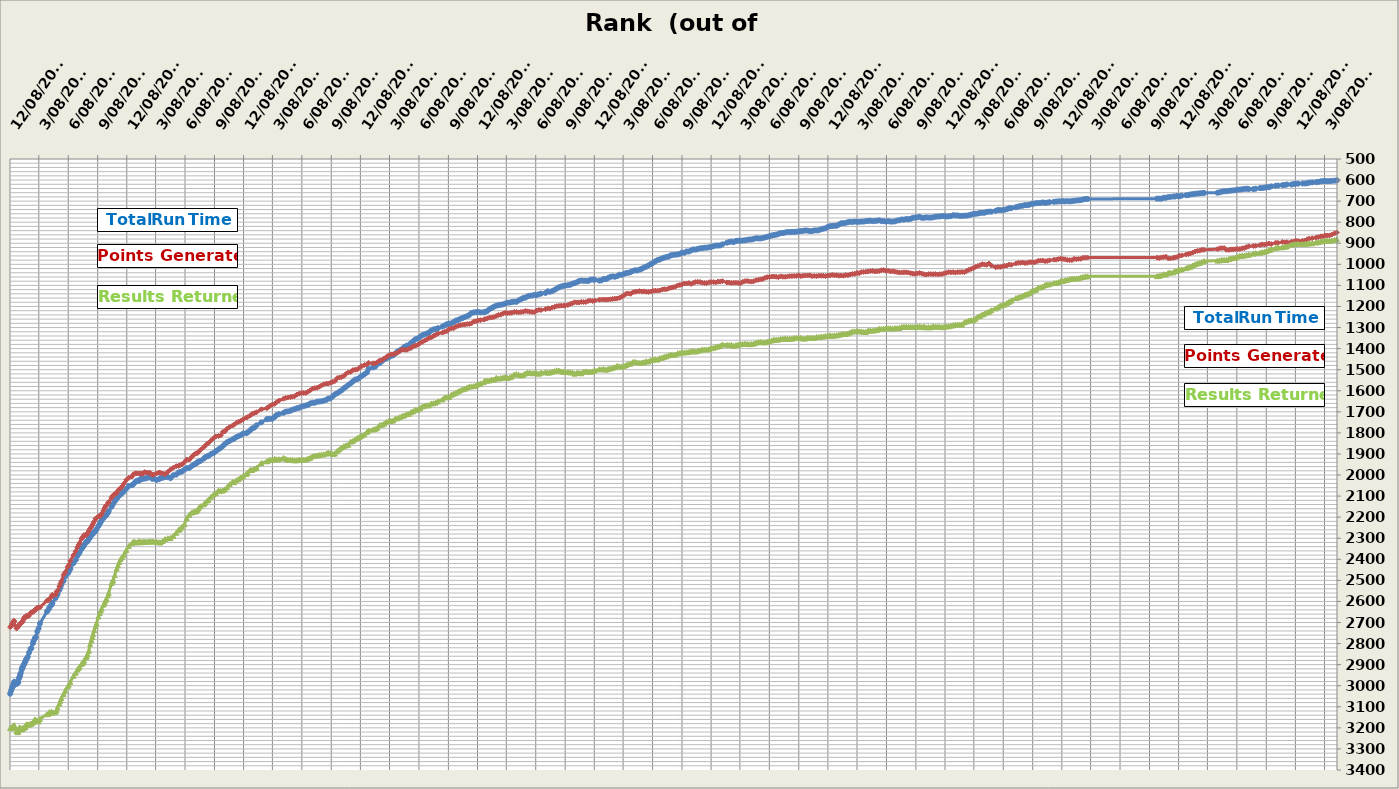
| Category | Series 0 | Series 1 | Series 2 |
|---|---|---|---|
| 2012-12-08 | 3038 | 2722 | 3201 |
| 2012-12-11 | 3024 | 2717 | 3199 |
| 2012-12-13 | 3014 | 2713 | 3202 |
| 2012-12-15 | 3005 | 2705 | 3197 |
| 2012-12-16 | 3003 | 2704 | 3196 |
| 2012-12-17 | 3002 | 2701 | 3196 |
| 2012-12-18 | 2995 | 2697 | 3193 |
| 2012-12-19 | 2992 | 2693 | 3191 |
| 2012-12-20 | 2991 | 2697 | 3190 |
| 2012-12-21 | 2981 | 2693 | 3187 |
| 2012-12-28 | 2992 | 2728 | 3215 |
| 2012-12-31 | 2988 | 2721 | 3220 |
| 2013-01-01 | 2984 | 2722 | 3220 |
| 2013-01-02 | 2983 | 2716 | 3215 |
| 2013-01-04 | 2967 | 2714 | 3202 |
| 2013-01-06 | 2959 | 2710 | 3199 |
| 2013-01-07 | 2957 | 2709 | 3199 |
| 2013-01-08 | 2948 | 2709 | 3201 |
| 2013-01-10 | 2940 | 2701 | 3206 |
| 2013-01-13 | 2924 | 2697 | 3207 |
| 2013-01-14 | 2920 | 2700 | 3206 |
| 2013-01-15 | 2915 | 2699 | 3202 |
| 2013-01-16 | 2912 | 2694 | 3203 |
| 2013-01-19 | 2901 | 2684 | 3199 |
| 2013-01-21 | 2897 | 2675 | 3199 |
| 2013-01-24 | 2887 | 2678 | 3195 |
| 2013-01-25 | 2882 | 2674 | 3195 |
| 2013-01-27 | 2874 | 2669 | 3184 |
| 2013-01-29 | 2871 | 2667 | 3185 |
| 2013-02-01 | 2863 | 2671 | 3183 |
| 2013-02-05 | 2843 | 2668 | 3185 |
| 2013-02-10 | 2825 | 2654 | 3179 |
| 2013-02-12 | 2822 | 2652 | 3181 |
| 2013-02-17 | 2799 | 2651 | 3175 |
| 2013-02-19 | 2788 | 2645 | 3169 |
| 2013-02-23 | 2776 | 2641 | 3163 |
| 2013-02-24 | 2774 | 2639 | 3160 |
| 2013-02-26 | 2769 | 2640 | 3164 |
| 2013-03-03 | 2742 | 2629 | 3167 |
| 2013-03-07 | 2727 | 2630 | 3169 |
| 2013-03-11 | 2705 | 2628 | 3158 |
| 2013-04-02 | 2648 | 2596 | 3135 |
| 2013-04-07 | 2638 | 2595 | 3133 |
| 2013-04-10 | 2628 | 2587 | 3125 |
| 2013-04-16 | 2616 | 2579 | 3124 |
| 2013-04-17 | 2614 | 2575 | 3126 |
| 2013-04-19 | 2607 | 2568 | 3128 |
| 2013-04-29 | 2584 | 2568 | 3124 |
| 2013-05-02 | 2572 | 2554 | 3116 |
| 2013-05-05 | 2566 | 2549 | 3103 |
| 2013-05-11 | 2545 | 2528 | 3085 |
| 2013-05-14 | 2534 | 2516 | 3071 |
| 2013-05-17 | 2521 | 2504 | 3059 |
| 2013-05-24 | 2503 | 2473 | 3040 |
| 2013-05-29 | 2482 | 2461 | 3023 |
| 2013-06-06 | 2467 | 2436 | 3003 |
| 2013-06-09 | 2460 | 2428 | 2995 |
| 2013-06-14 | 2446 | 2407 | 2982 |
| 2013-06-24 | 2418 | 2380 | 2953 |
| 2013-07-01 | 2403 | 2361 | 2938 |
| 2013-07-06 | 2384 | 2343 | 2923 |
| 2013-07-10 | 2374 | 2331 | 2916 |
| 2013-07-13 | 2367 | 2322 | 2909 |
| 2013-07-19 | 2351 | 2302 | 2896 |
| 2013-07-22 | 2344 | 2297 | 2893 |
| 2013-07-25 | 2338 | 2291 | 2888 |
| 2013-07-27 | 2333 | 2285 | 2880 |
| 2013-08-02 | 2318 | 2286 | 2865 |
| 2013-08-04 | 2319 | 2283 | 2859 |
| 2013-08-07 | 2314 | 2275 | 2851 |
| 2013-08-11 | 2304 | 2264 | 2834 |
| 2013-08-15 | 2296 | 2254 | 2802 |
| 2013-08-19 | 2284 | 2246 | 2783 |
| 2013-08-22 | 2282 | 2238 | 2769 |
| 2013-08-24 | 2277 | 2231 | 2755 |
| 2013-08-28 | 2269 | 2220 | 2736 |
| 2013-09-01 | 2266 | 2207 | 2717 |
| 2013-09-04 | 2257 | 2203 | 2704 |
| 2013-09-10 | 2242 | 2196 | 2671 |
| 2013-09-14 | 2232 | 2197 | 2655 |
| 2013-09-17 | 2223 | 2191 | 2643 |
| 2013-09-20 | 2215 | 2183 | 2634 |
| 2013-09-26 | 2204 | 2168 | 2615 |
| 2013-09-29 | 2198 | 2157 | 2606 |
| 2013-10-02 | 2192 | 2148 | 2595 |
| 2013-10-05 | 2189 | 2145 | 2587 |
| 2013-10-10 | 2179 | 2132 | 2571 |
| 2013-10-12 | 2171 | 2129 | 2559 |
| 2013-10-21 | 2150 | 2108 | 2513 |
| 2013-10-23 | 2142 | 2101 | 2505 |
| 2013-10-26 | 2136 | 2098 | 2499 |
| 2013-10-31 | 2125 | 2089 | 2475 |
| 2013-11-06 | 2113 | 2086 | 2444 |
| 2013-11-10 | 2103 | 2073 | 2429 |
| 2013-11-14 | 2097 | 2068 | 2413 |
| 2013-11-18 | 2093 | 2063 | 2399 |
| 2013-11-23 | 2084 | 2054 | 2390 |
| 2013-11-28 | 2079 | 2041 | 2378 |
| 2013-12-06 | 2065 | 2023 | 2356 |
| 2013-12-14 | 2052 | 2013 | 2337 |
| 2013-12-24 | 2048 | 2007 | 2323 |
| 2013-12-28 | 2043 | 1997 | 2316 |
| 2014-01-02 | 2035 | 1992 | 2318 |
| 2014-01-08 | 2027 | 1992 | 2320 |
| 2014-01-14 | 2028 | 1993 | 2314 |
| 2014-01-19 | 2019 | 1992 | 2318 |
| 2014-01-22 | 2020 | 1995 | 2319 |
| 2014-01-27 | 2017 | 1994 | 2316 |
| 2014-02-01 | 2017 | 1986 | 2316 |
| 2014-02-07 | 2015 | 1988 | 2317 |
| 2014-02-12 | 2012 | 1990 | 2317 |
| 2014-02-18 | 2007 | 1989 | 2314 |
| 2014-02-25 | 2018 | 2000 | 2315 |
| 2014-03-01 | 2016 | 1998 | 2316 |
| 2014-03-10 | 2023 | 1993 | 2316 |
| 2014-03-18 | 2020 | 1988 | 2319 |
| 2014-03-23 | 2014 | 1990 | 2320 |
| 2014-03-30 | 2013 | 1993 | 2313 |
| 2014-04-06 | 2010 | 1996 | 2304 |
| 2014-04-15 | 2010 | 1985 | 2300 |
| 2014-04-23 | 2015 | 1974 | 2299 |
| 2014-05-02 | 2001 | 1965 | 2289 |
| 2014-05-11 | 1998 | 1958 | 2274 |
| 2014-05-18 | 1988 | 1957 | 2260 |
| 2014-05-23 | 1986 | 1953 | 2257 |
| 2014-05-29 | 1983 | 1949 | 2247 |
| 2014-06-06 | 1974 | 1939 | 2233 |
| 2014-06-13 | 1967 | 1926 | 2204 |
| 2014-06-21 | 1966 | 1927 | 2189 |
| 2014-06-28 | 1958 | 1915 | 2178 |
| 2014-07-04 | 1951 | 1905 | 2174 |
| 2014-07-10 | 1948 | 1899 | 2172 |
| 2014-07-13 | 1943 | 1897 | 2172 |
| 2014-07-17 | 1939 | 1895 | 2165 |
| 2014-07-20 | 1936 | 1889 | 2157 |
| 2014-07-26 | 1933 | 1880 | 2148 |
| 2014-08-05 | 1922 | 1868 | 2139 |
| 2014-08-10 | 1915 | 1860 | 2131 |
| 2014-08-16 | 1911 | 1851 | 2121 |
| 2014-08-20 | 1909 | 1847 | 2117 |
| 2014-08-28 | 1900 | 1836 | 2103 |
| 2014-09-05 | 1895 | 1825 | 2092 |
| 2014-09-12 | 1887 | 1817 | 2086 |
| 2014-09-20 | 1878 | 1815 | 2073 |
| 2014-09-27 | 1871 | 1812 | 2075 |
| 2014-10-04 | 1862 | 1795 | 2073 |
| 2014-10-10 | 1853 | 1793 | 2068 |
| 2014-10-17 | 1844 | 1780 | 2058 |
| 2014-10-25 | 1838 | 1772 | 2044 |
| 2014-11-03 | 1831 | 1765 | 2032 |
| 2014-11-08 | 1827 | 1761 | 2034 |
| 2014-11-15 | 1820 | 1752 | 2025 |
| 2014-11-22 | 1815 | 1747 | 2019 |
| 2014-11-29 | 1811 | 1743 | 2012 |
| 2014-12-06 | 1803 | 1736 | 2006 |
| 2014-12-16 | 1801 | 1727 | 1995 |
| 2014-12-20 | 1798 | 1725 | 1989 |
| 2014-12-28 | 1788 | 1718 | 1976 |
| 2015-01-03 | 1779 | 1710 | 1976 |
| 2015-01-10 | 1775 | 1706 | 1970 |
| 2015-01-17 | 1764 | 1702 | 1966 |
| 2015-02-01 | 1750 | 1688 | 1943 |
| 2015-02-18 | 1735 | 1683 | 1935 |
| 2015-02-21 | 1734 | 1679 | 1932 |
| 2015-02-28 | 1733 | 1672 | 1927 |
| 2015-03-07 | 1733 | 1666 | 1928 |
| 2015-03-15 | 1724 | 1662 | 1923 |
| 2015-03-21 | 1715 | 1654 | 1926 |
| 2015-03-28 | 1711 | 1647 | 1925 |
| 2015-04-11 | 1705 | 1638 | 1919 |
| 2015-04-18 | 1699 | 1634 | 1923 |
| 2015-04-25 | 1698 | 1632 | 1928 |
| 2015-05-03 | 1695 | 1630 | 1927 |
| 2015-05-09 | 1690 | 1628 | 1929 |
| 2015-05-16 | 1687 | 1626 | 1930 |
| 2015-05-23 | 1683 | 1618 | 1930 |
| 2015-05-30 | 1681 | 1614 | 1927 |
| 2015-06-06 | 1675 | 1611 | 1927 |
| 2015-06-13 | 1673 | 1610 | 1927 |
| 2015-06-20 | 1670 | 1611 | 1926 |
| 2015-06-27 | 1667 | 1604 | 1922 |
| 2015-07-04 | 1660 | 1598 | 1918 |
| 2015-07-11 | 1657 | 1590 | 1911 |
| 2015-07-18 | 1657 | 1587 | 1908 |
| 2015-07-25 | 1652 | 1586 | 1907 |
| 2015-08-01 | 1651 | 1581 | 1905 |
| 2015-08-08 | 1650 | 1575 | 1902 |
| 2015-08-15 | 1647 | 1569 | 1902 |
| 2015-08-23 | 1643 | 1566 | 1898 |
| 2015-08-29 | 1637 | 1566 | 1894 |
| 2015-09-05 | 1636 | 1562 | 1896 |
| 2015-09-12 | 1627 | 1558 | 1900 |
| 2015-09-19 | 1617 | 1554 | 1898 |
| 2015-09-26 | 1612 | 1540 | 1886 |
| 2015-10-03 | 1604 | 1537 | 1878 |
| 2015-10-10 | 1598 | 1535 | 1869 |
| 2015-10-17 | 1588 | 1530 | 1863 |
| 2015-10-24 | 1581 | 1519 | 1859 |
| 2015-10-31 | 1572 | 1513 | 1856 |
| 2015-11-07 | 1565 | 1511 | 1841 |
| 2015-11-14 | 1556 | 1502 | 1839 |
| 2015-11-21 | 1547 | 1500 | 1831 |
| 2015-11-28 | 1545 | 1499 | 1824 |
| 2015-12-05 | 1538 | 1490 | 1819 |
| 2015-12-12 | 1529 | 1483 | 1813 |
| 2015-12-20 | 1522 | 1478 | 1807 |
| 2015-12-28 | 1513 | 1475 | 1796 |
| 2016-01-02 | 1496 | 1468 | 1789 |
| 2016-01-16 | 1489 | 1470 | 1784 |
| 2016-01-23 | 1486 | 1470 | 1781 |
| 2016-01-30 | 1473 | 1464 | 1775 |
| 2016-02-06 | 1469 | 1456 | 1763 |
| 2016-02-13 | 1459 | 1455 | 1761 |
| 2016-02-20 | 1451 | 1447 | 1756 |
| 2016-02-27 | 1446 | 1439 | 1748 |
| 2016-03-05 | 1442 | 1432 | 1744 |
| 2016-03-12 | 1435 | 1427 | 1743 |
| 2016-03-19 | 1432 | 1427 | 1741 |
| 2016-03-26 | 1423 | 1423 | 1732 |
| 2016-04-02 | 1413 | 1419 | 1730 |
| 2016-04-09 | 1408 | 1411 | 1725 |
| 2016-04-16 | 1401 | 1404 | 1720 |
| 2016-04-23 | 1392 | 1405 | 1717 |
| 2016-04-30 | 1386 | 1406 | 1711 |
| 2016-05-07 | 1384 | 1401 | 1710 |
| 2016-05-14 | 1373 | 1397 | 1701 |
| 2016-05-21 | 1364 | 1388 | 1697 |
| 2016-05-28 | 1355 | 1386 | 1690 |
| 2016-06-04 | 1352 | 1381 | 1690 |
| 2016-06-11 | 1344 | 1374 | 1683 |
| 2016-06-18 | 1336 | 1368 | 1675 |
| 2016-06-25 | 1333 | 1362 | 1671 |
| 2016-07-02 | 1328 | 1357 | 1669 |
| 2016-07-09 | 1324 | 1349 | 1669 |
| 2016-07-16 | 1314 | 1347 | 1660 |
| 2016-07-23 | 1309 | 1340 | 1659 |
| 2016-07-30 | 1307 | 1335 | 1656 |
| 2016-08-06 | 1303 | 1329 | 1650 |
| 2016-08-20 | 1295 | 1324 | 1641 |
| 2016-08-27 | 1290 | 1320 | 1631 |
| 2016-09-03 | 1284 | 1317 | 1631 |
| 2016-09-10 | 1282 | 1307 | 1630 |
| 2016-09-17 | 1280 | 1304 | 1619 |
| 2016-09-24 | 1274 | 1303 | 1614 |
| 2016-10-01 | 1267 | 1296 | 1610 |
| 2016-10-08 | 1264 | 1292 | 1603 |
| 2016-10-15 | 1258 | 1289 | 1598 |
| 2016-10-22 | 1255 | 1286 | 1593 |
| 2016-10-29 | 1250 | 1286 | 1590 |
| 2016-11-05 | 1246 | 1283 | 1585 |
| 2016-11-12 | 1240 | 1283 | 1580 |
| 2016-11-19 | 1231 | 1280 | 1579 |
| 2016-11-26 | 1228 | 1271 | 1578 |
| 2016-12-03 | 1227 | 1270 | 1575 |
| 2016-12-10 | 1226 | 1266 | 1569 |
| 2016-12-17 | 1228 | 1265 | 1565 |
| 2016-12-27 | 1227 | 1262 | 1559 |
| 2016-12-31 | 1226 | 1260 | 1552 |
| 2017-01-07 | 1221 | 1257 | 1552 |
| 2017-01-14 | 1213 | 1253 | 1551 |
| 2017-01-21 | 1207 | 1252 | 1547 |
| 2017-01-28 | 1201 | 1250 | 1547 |
| 2017-02-04 | 1196 | 1245 | 1538 |
| 2017-02-11 | 1194 | 1240 | 1542 |
| 2017-02-18 | 1192 | 1239 | 1540 |
| 2017-02-25 | 1190 | 1234 | 1538 |
| 2017-03-04 | 1186 | 1230 | 1535 |
| 2017-03-11 | 1182 | 1232 | 1539 |
| 2017-03-19 | 1181 | 1231 | 1536 |
| 2017-03-25 | 1179 | 1230 | 1532 |
| 2017-04-01 | 1177 | 1226 | 1523 |
| 2017-04-08 | 1178 | 1226 | 1521 |
| 2017-04-15 | 1171 | 1228 | 1524 |
| 2017-04-22 | 1166 | 1226 | 1527 |
| 2017-04-29 | 1160 | 1225 | 1525 |
| 2017-05-06 | 1158 | 1221 | 1518 |
| 2017-05-13 | 1152 | 1223 | 1514 |
| 2017-05-20 | 1149 | 1225 | 1515 |
| 2017-05-27 | 1148 | 1226 | 1517 |
| 2017-06-03 | 1145 | 1227 | 1516 |
| 2017-06-10 | 1146 | 1220 | 1516 |
| 2017-06-17 | 1142 | 1216 | 1519 |
| 2017-06-24 | 1139 | 1217 | 1514 |
| 2017-07-08 | 1136 | 1213 | 1512 |
| 2017-07-15 | 1128 | 1209 | 1514 |
| 2017-07-22 | 1130 | 1210 | 1513 |
| 2017-07-29 | 1127 | 1205 | 1510 |
| 2017-08-05 | 1121 | 1202 | 1507 |
| 2017-08-12 | 1115 | 1198 | 1503 |
| 2017-08-19 | 1109 | 1197 | 1504 |
| 2017-08-26 | 1105 | 1196 | 1508 |
| 2017-09-02 | 1102 | 1196 | 1510 |
| 2017-09-07 | 1101 | 1196 | 1511 |
| 2017-09-16 | 1099 | 1193 | 1511 |
| 2017-09-23 | 1097 | 1188 | 1513 |
| 2017-09-30 | 1092 | 1185 | 1513 |
| 2017-10-07 | 1089 | 1180 | 1519 |
| 2017-10-14 | 1085 | 1181 | 1515 |
| 2017-10-21 | 1079 | 1181 | 1515 |
| 2017-10-28 | 1077 | 1178 | 1517 |
| 2017-11-04 | 1078 | 1179 | 1509 |
| 2017-11-11 | 1078 | 1179 | 1508 |
| 2017-11-18 | 1079 | 1174 | 1510 |
| 2017-11-25 | 1073 | 1172 | 1510 |
| 2017-12-02 | 1072 | 1174 | 1508 |
| 2017-12-09 | 1073 | 1172 | 1504 |
| 2017-12-23 | 1077 | 1168 | 1498 |
| 2017-12-30 | 1076 | 1167 | 1498 |
| 2018-01-06 | 1069 | 1167 | 1497 |
| 2018-01-13 | 1070 | 1168 | 1500 |
| 2018-01-20 | 1064 | 1167 | 1496 |
| 2018-01-27 | 1059 | 1166 | 1494 |
| 2018-02-03 | 1057 | 1164 | 1491 |
| 2018-02-10 | 1059 | 1163 | 1488 |
| 2018-02-17 | 1056 | 1162 | 1482 |
| 2018-02-24 | 1049 | 1159 | 1484 |
| 2018-03-03 | 1050 | 1154 | 1485 |
| 2018-03-10 | 1046 | 1147 | 1483 |
| 2018-03-17 | 1041 | 1140 | 1478 |
| 2018-03-24 | 1040 | 1138 | 1473 |
| 2018-03-31 | 1037 | 1140 | 1471 |
| 2018-04-07 | 1031 | 1133 | 1464 |
| 2018-04-14 | 1028 | 1130 | 1463 |
| 2018-04-21 | 1029 | 1129 | 1466 |
| 2018-04-28 | 1025 | 1127 | 1467 |
| 2018-05-05 | 1021 | 1129 | 1466 |
| 2018-05-12 | 1015 | 1128 | 1464 |
| 2018-05-19 | 1011 | 1130 | 1460 |
| 2018-05-26 | 1005 | 1131 | 1461 |
| 2018-06-02 | 999 | 1129 | 1454 |
| 2018-06-09 | 993 | 1126 | 1453 |
| 2018-06-16 | 986 | 1125 | 1450 |
| 2018-06-23 | 980 | 1125 | 1452 |
| 2018-06-30 | 977 | 1124 | 1445 |
| 2018-07-07 | 972 | 1120 | 1443 |
| 2018-07-14 | 968 | 1118 | 1439 |
| 2018-07-21 | 965 | 1119 | 1436 |
| 2018-07-28 | 963 | 1114 | 1432 |
| 2018-08-04 | 957 | 1111 | 1429 |
| 2018-08-11 | 955 | 1109 | 1430 |
| 2018-08-18 | 954 | 1106 | 1428 |
| 2018-08-25 | 953 | 1100 | 1422 |
| 2018-09-01 | 950 | 1098 | 1421 |
| 2018-09-08 | 944 | 1095 | 1418 |
| 2018-09-15 | 945 | 1091 | 1418 |
| 2018-09-22 | 939 | 1091 | 1417 |
| 2018-09-29 | 939 | 1089 | 1416 |
| 2018-10-06 | 934 | 1093 | 1413 |
| 2018-10-13 | 929 | 1088 | 1411 |
| 2018-10-20 | 930 | 1084 | 1414 |
| 2018-10-27 | 927 | 1083 | 1410 |
| 2018-11-03 | 924 | 1084 | 1408 |
| 2018-11-10 | 923 | 1087 | 1404 |
| 2018-11-17 | 921 | 1088 | 1404 |
| 2018-11-24 | 921 | 1089 | 1404 |
| 2018-12-01 | 919 | 1085 | 1403 |
| 2018-12-08 | 917 | 1085 | 1398 |
| 2018-12-15 | 914 | 1084 | 1396 |
| 2018-12-22 | 911 | 1086 | 1392 |
| 2018-12-29 | 911 | 1082 | 1390 |
| 2019-01-05 | 910 | 1082 | 1387 |
| 2019-01-12 | 905 | 1080 | 1380 |
| 2019-01-26 | 897 | 1086 | 1382 |
| 2019-02-02 | 894 | 1086 | 1383 |
| 2019-02-09 | 892 | 1088 | 1382 |
| 2019-02-16 | 895 | 1087 | 1387 |
| 2019-02-23 | 889 | 1087 | 1383 |
| 2019-03-02 | 888 | 1088 | 1382 |
| 2019-03-09 | 888 | 1090 | 1379 |
| 2019-03-16 | 887 | 1083 | 1378 |
| 2019-03-23 | 886 | 1080 | 1377 |
| 2019-03-30 | 884 | 1079 | 1378 |
| 2019-04-06 | 882 | 1081 | 1379 |
| 2019-04-13 | 882 | 1082 | 1378 |
| 2019-04-20 | 879 | 1080 | 1376 |
| 2019-04-27 | 876 | 1075 | 1372 |
| 2019-05-04 | 877 | 1074 | 1369 |
| 2019-05-11 | 877 | 1071 | 1368 |
| 2019-05-18 | 875 | 1070 | 1370 |
| 2019-05-25 | 872 | 1064 | 1370 |
| 2019-06-01 | 869 | 1061 | 1367 |
| 2019-06-08 | 867 | 1060 | 1363 |
| 2019-06-15 | 863 | 1058 | 1361 |
| 2019-06-22 | 861 | 1058 | 1357 |
| 2019-06-29 | 859 | 1059 | 1358 |
| 2019-07-06 | 856 | 1061 | 1357 |
| 2019-07-13 | 852 | 1057 | 1354 |
| 2019-07-20 | 851 | 1059 | 1354 |
| 2019-07-27 | 849 | 1059 | 1351 |
| 2019-08-03 | 846 | 1058 | 1354 |
| 2019-08-10 | 847 | 1056 | 1352 |
| 2019-08-17 | 846 | 1056 | 1353 |
| 2019-08-24 | 846 | 1055 | 1349 |
| 2019-08-31 | 845 | 1055 | 1349 |
| 2019-09-07 | 844 | 1052 | 1350 |
| 2019-09-14 | 842 | 1056 | 1349 |
| 2019-09-21 | 841 | 1054 | 1352 |
| 2019-09-28 | 839 | 1053 | 1352 |
| 2019-10-05 | 840 | 1053 | 1347 |
| 2019-10-12 | 842 | 1052 | 1348 |
| 2019-10-19 | 842 | 1056 | 1349 |
| 2019-10-26 | 839 | 1055 | 1349 |
| 2019-11-02 | 839 | 1056 | 1345 |
| 2019-11-09 | 838 | 1054 | 1345 |
| 2019-11-16 | 834 | 1054 | 1343 |
| 2019-11-23 | 831 | 1054 | 1343 |
| 2019-11-30 | 829 | 1056 | 1340 |
| 2019-12-07 | 823 | 1053 | 1340 |
| 2019-12-14 | 819 | 1053 | 1337 |
| 2019-12-21 | 818 | 1050 | 1339 |
| 2019-12-28 | 817 | 1052 | 1337 |
| 2020-01-04 | 817 | 1052 | 1337 |
| 2020-01-11 | 811 | 1054 | 1334 |
| 2020-01-18 | 805 | 1053 | 1332 |
| 2020-01-25 | 805 | 1054 | 1329 |
| 2020-02-01 | 803 | 1051 | 1330 |
| 2020-02-08 | 800 | 1052 | 1328 |
| 2020-02-15 | 798 | 1048 | 1323 |
| 2020-02-22 | 799 | 1046 | 1318 |
| 2020-02-29 | 797 | 1045 | 1318 |
| 2020-03-07 | 798 | 1041 | 1316 |
| 2020-03-14 | 798 | 1042 | 1318 |
| 2020-03-21 | 797 | 1037 | 1318 |
| 2020-03-28 | 797 | 1036 | 1320 |
| 2020-04-04 | 795 | 1035 | 1321 |
| 2020-04-11 | 794 | 1034 | 1315 |
| 2020-04-18 | 793 | 1032 | 1314 |
| 2020-04-25 | 795 | 1031 | 1314 |
| 2020-05-02 | 794 | 1034 | 1313 |
| 2020-05-09 | 793 | 1033 | 1311 |
| 2020-05-16 | 791 | 1032 | 1306 |
| 2020-05-23 | 795 | 1028 | 1306 |
| 2020-05-30 | 795 | 1027 | 1305 |
| 2020-06-06 | 797 | 1031 | 1304 |
| 2020-06-13 | 795 | 1030 | 1303 |
| 2020-06-20 | 797 | 1034 | 1303 |
| 2020-06-27 | 797 | 1033 | 1305 |
| 2020-07-04 | 796 | 1035 | 1303 |
| 2020-07-11 | 792 | 1037 | 1303 |
| 2020-07-18 | 791 | 1039 | 1302 |
| 2020-07-25 | 787 | 1039 | 1297 |
| 2020-08-01 | 788 | 1038 | 1297 |
| 2020-08-08 | 785 | 1038 | 1296 |
| 2020-08-15 | 786 | 1039 | 1297 |
| 2020-08-22 | 784 | 1042 | 1296 |
| 2020-08-29 | 779 | 1044 | 1297 |
| 2020-09-05 | 778 | 1045 | 1298 |
| 2020-09-12 | 777 | 1043 | 1296 |
| 2020-09-19 | 774 | 1041 | 1294 |
| 2020-09-26 | 779 | 1044 | 1298 |
| 2020-10-03 | 779 | 1047 | 1295 |
| 2020-10-10 | 777 | 1049 | 1299 |
| 2020-10-17 | 778 | 1046 | 1298 |
| 2020-10-24 | 778 | 1046 | 1299 |
| 2020-10-31 | 777 | 1047 | 1294 |
| 2020-11-07 | 774 | 1046 | 1296 |
| 2020-11-14 | 773 | 1048 | 1295 |
| 2020-11-21 | 773 | 1047 | 1297 |
| 2020-11-28 | 771 | 1046 | 1298 |
| 2020-12-05 | 771 | 1043 | 1296 |
| 2020-12-12 | 773 | 1040 | 1294 |
| 2020-12-19 | 772 | 1037 | 1294 |
| 2020-12-26 | 771 | 1038 | 1291 |
| 2021-01-02 | 767 | 1037 | 1289 |
| 2021-01-09 | 768 | 1039 | 1286 |
| 2021-01-16 | 768 | 1037 | 1286 |
| 2021-01-23 | 770 | 1037 | 1286 |
| 2021-01-30 | 770 | 1036 | 1285 |
| 2021-02-06 | 769 | 1037 | 1275 |
| 2021-02-13 | 769 | 1032 | 1271 |
| 2021-02-20 | 767 | 1026 | 1267 |
| 2021-02-27 | 764 | 1022 | 1265 |
| 2021-03-06 | 761 | 1018 | 1265 |
| 2021-03-13 | 760 | 1012 | 1258 |
| 2021-03-20 | 759 | 1008 | 1248 |
| 2021-03-27 | 756 | 1004 | 1245 |
| 2021-04-03 | 755 | 999 | 1238 |
| 2021-04-10 | 755 | 1001 | 1234 |
| 2021-04-17 | 751 | 1002 | 1228 |
| 2021-04-24 | 750 | 996 | 1225 |
| 2021-05-01 | 750 | 1005 | 1218 |
| 2021-05-15 | 746 | 1014 | 1209 |
| 2021-05-22 | 742 | 1012 | 1203 |
| 2021-05-29 | 743 | 1013 | 1196 |
| 2021-06-05 | 743 | 1010 | 1193 |
| 2021-06-12 | 741 | 1007 | 1191 |
| 2021-06-19 | 738 | 1006 | 1183 |
| 2021-06-26 | 734 | 1001 | 1178 |
| 2021-07-03 | 733 | 1002 | 1172 |
| 2021-07-17 | 729 | 996 | 1160 |
| 2021-07-24 | 726 | 993 | 1157 |
| 2021-07-31 | 723 | 993 | 1154 |
| 2021-08-07 | 722 | 991 | 1149 |
| 2021-08-14 | 719 | 994 | 1144 |
| 2021-08-21 | 719 | 993 | 1141 |
| 2021-08-28 | 717 | 990 | 1137 |
| 2021-09-04 | 713 | 990 | 1128 |
| 2021-09-11 | 712 | 991 | 1124 |
| 2021-09-18 | 710 | 988 | 1120 |
| 2021-09-25 | 709 | 983 | 1110 |
| 2021-10-02 | 709 | 982 | 1109 |
| 2021-10-09 | 706 | 982 | 1105 |
| 2021-10-16 | 708 | 985 | 1098 |
| 2021-10-23 | 707 | 984 | 1096 |
| 2021-10-30 | 705 | 981 | 1094 |
| 2021-11-13 | 703 | 978 | 1089 |
| 2021-11-20 | 702 | 978 | 1088 |
| 2021-11-27 | 701 | 975 | 1085 |
| 2021-12-04 | 701 | 973 | 1079 |
| 2021-12-11 | 700 | 975 | 1079 |
| 2021-12-18 | 701 | 976 | 1075 |
| 2021-12-25 | 700 | 979 | 1073 |
| 2022-01-01 | 701 | 980 | 1070 |
| 2022-01-08 | 700 | 980 | 1068 |
| 2022-01-15 | 698 | 974 | 1067 |
| 2022-01-22 | 697 | 976 | 1067 |
| 2022-01-29 | 696 | 974 | 1066 |
| 2022-02-05 | 695 | 974 | 1062 |
| 2022-02-12 | 692 | 969 | 1060 |
| 2022-02-19 | 690 | 968 | 1057 |
| 2022-02-26 | 690 | 968 | 1057 |
| 2022-10-01 | 688 | 968 | 1056 |
| 2022-10-08 | 688 | 970 | 1055 |
| 2022-10-15 | 688 | 967 | 1051 |
| 2022-10-22 | 684 | 966 | 1047 |
| 2022-10-29 | 684 | 964 | 1048 |
| 2022-11-05 | 681 | 971 | 1040 |
| 2022-11-12 | 680 | 972 | 1039 |
| 2022-11-21 | 678 | 969 | 1038 |
| 2022-11-26 | 678 | 967 | 1033 |
| 2022-12-03 | 675 | 965 | 1030 |
| 2022-12-10 | 677 | 959 | 1025 |
| 2022-12-17 | 674 | 958 | 1024 |
| 2022-12-31 | 672 | 953 | 1018 |
| 2023-01-07 | 671 | 951 | 1014 |
| 2023-01-14 | 668 | 948 | 1011 |
| 2023-01-21 | 667 | 944 | 1005 |
| 2023-01-28 | 665 | 939 | 1000 |
| 2023-02-04 | 664 | 936 | 996 |
| 2023-02-11 | 663 | 935 | 993 |
| 2023-02-18 | 662 | 931 | 989 |
| 2023-02-25 | 661 | 931 | 985 |
| 2023-04-08 | 660 | 928 | 982 |
| 2023-04-15 | 658 | 924 | 981 |
| 2023-04-22 | 655 | 923 | 979 |
| 2023-04-29 | 653 | 923 | 979 |
| 2023-05-06 | 653 | 931 | 979 |
| 2023-05-14 | 651 | 931 | 974 |
| 2023-05-20 | 650 | 929 | 972 |
| 2023-05-27 | 649 | 929 | 970 |
| 2023-06-03 | 648 | 928 | 969 |
| 2023-06-10 | 646 | 927 | 963 |
| 2023-06-17 | 645 | 927 | 960 |
| 2023-06-24 | 644 | 924 | 959 |
| 2023-07-01 | 642 | 923 | 958 |
| 2023-07-08 | 641 | 918 | 956 |
| 2023-07-15 | 643 | 914 | 954 |
| 2023-07-29 | 643 | 913 | 949 |
| 2023-08-05 | 641 | 912 | 947 |
| 2023-08-19 | 638 | 908 | 945 |
| 2023-08-26 | 638 | 905 | 942 |
| 2023-09-02 | 636 | 906 | 940 |
| 2023-09-09 | 634 | 904 | 937 |
| 2023-09-16 | 634 | 901 | 932 |
| 2023-09-23 | 630 | 904 | 929 |
| 2023-10-07 | 627 | 897 | 922 |
| 2023-10-14 | 626 | 898 | 920 |
| 2023-10-28 | 624 | 894 | 919 |
| 2023-11-04 | 623 | 896 | 916 |
| 2023-11-11 | 621 | 895 | 915 |
| 2023-11-25 | 621 | 893 | 906 |
| 2023-12-02 | 618 | 891 | 904 |
| 2023-12-09 | 617 | 888 | 904 |
| 2023-12-16 | 617 | 889 | 902 |
| 2023-12-30 | 616 | 888 | 903 |
| 2024-01-07 | 616 | 887 | 903 |
| 2024-01-14 | 615 | 881 | 901 |
| 2024-01-20 | 612 | 878 | 900 |
| 2024-01-29 | 611 | 876 | 900 |
| 2024-02-10 | 610 | 873 | 896 |
| 2024-02-17 | 609 | 871 | 895 |
| 2024-02-25 | 606 | 867 | 892 |
| 2024-03-02 | 605 | 867 | 889 |
| 2024-03-09 | 605 | 863 | 888 |
| 2024-03-16 | 605 | 863 | 888 |
| 2024-03-23 | 605 | 863 | 888 |
| 2024-03-30 | 604 | 859 | 887 |
| 2024-04-08 | 603 | 853 | 883 |
| 2024-04-15 | 601 | 849 | 881 |